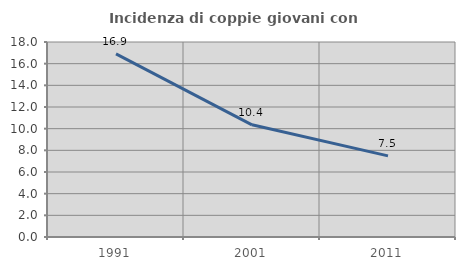
| Category | Incidenza di coppie giovani con figli |
|---|---|
| 1991.0 | 16.905 |
| 2001.0 | 10.356 |
| 2011.0 | 7.489 |